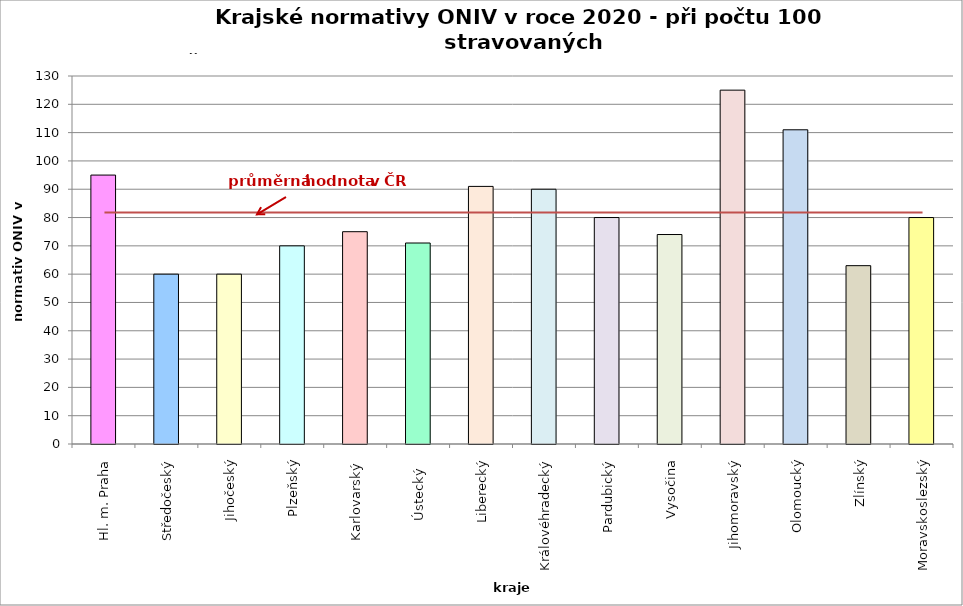
| Category | Series 0 |
|---|---|
| Hl. m. Praha | 95 |
| Středočeský | 60 |
| Jihočeský | 60 |
| Plzeňský | 70 |
| Karlovarský  | 75 |
| Ústecký   | 71 |
| Liberecký | 91 |
| Královéhradecký | 90 |
| Pardubický | 80 |
| Vysočina | 74 |
| Jihomoravský | 125 |
| Olomoucký | 111 |
| Zlínský | 63 |
| Moravskoslezský | 80 |